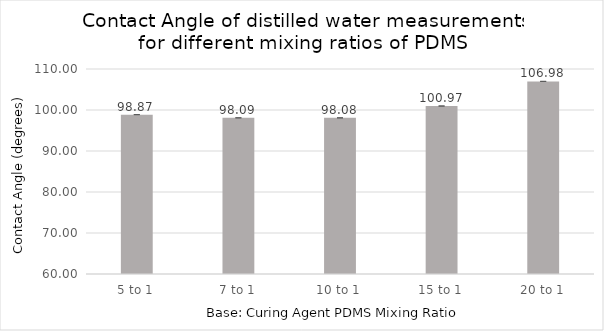
| Category | Contact Angle |
|---|---|
| 5 to 1 | 98.87 |
| 7 to 1 | 98.093 |
| 10 to 1 | 98.083 |
| 15 to 1 | 100.97 |
| 20 to 1 | 106.98 |